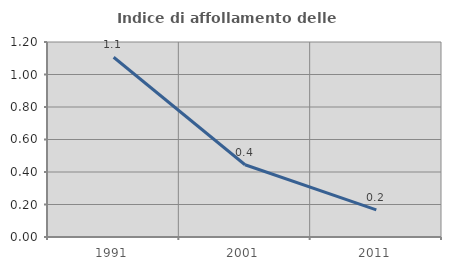
| Category | Indice di affollamento delle abitazioni  |
|---|---|
| 1991.0 | 1.106 |
| 2001.0 | 0.444 |
| 2011.0 | 0.167 |